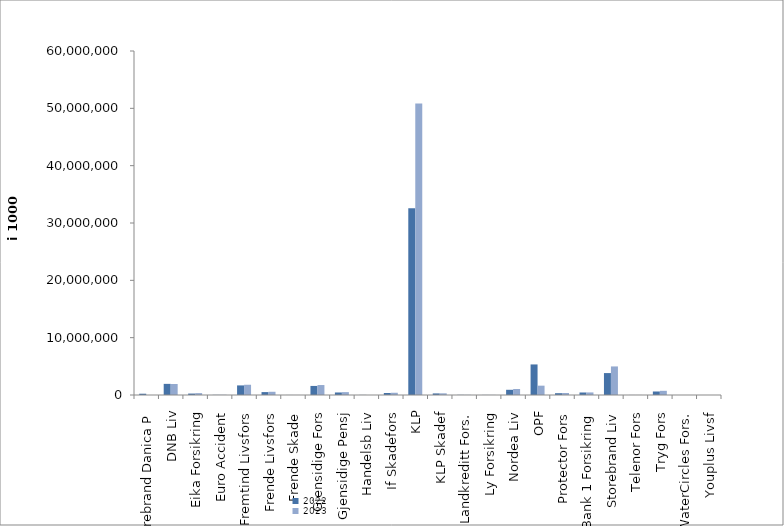
| Category | 2022 | 2023 |
|---|---|---|
| Storebrand Danica P | 223268.037 | 0 |
| DNB Liv | 1941687 | 1921772.935 |
| Eika Forsikring | 250147 | 328485 |
| Euro Accident | 26443 | 37969 |
| Fremtind Livsfors | 1672927.674 | 1787529.948 |
| Frende Livsfors | 508054 | 560991 |
| Frende Skade | 6356.36 | 6421.141 |
| Gjensidige Fors | 1581986.067 | 1738257.38 |
| Gjensidige Pensj | 439850 | 501647 |
| Handelsb Liv | 17030.985 | 0 |
| If Skadefors | 350741.561 | 390067.281 |
| KLP | 32592177.503 | 50821943.51 |
| KLP Skadef | 277149.278 | 291794.034 |
| Landkreditt Fors. | 26301 | 27211 |
| Ly Forsikring | 13753.589 | 17589.487 |
| Nordea Liv | 908883.661 | 1049648.603 |
| OPF | 5331000 | 1628400 |
| Protector Fors | 315226.973 | 344520.895 |
| SpareBank 1 Forsikring | 437108.782 | 447144.461 |
| Storebrand Liv | 3823393.788 | 4982353.114 |
| Telenor Fors | 7890 | 9384 |
| Tryg Fors | 611540 | 730497.887 |
| WaterCircles Fors. | 2120 | 1888 |
| Youplus Livsf | 1993 | 4956 |